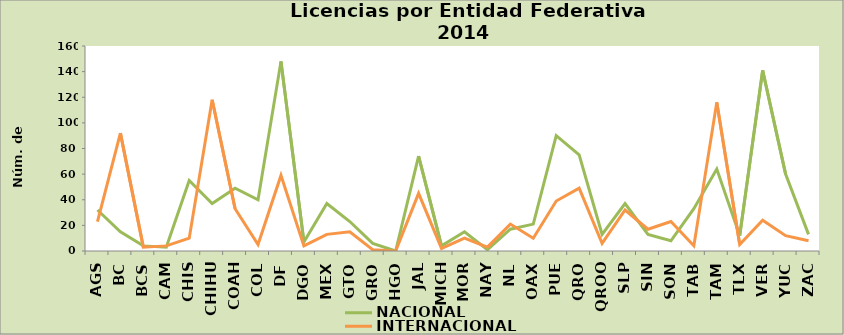
| Category | NACIONAL | INTERNACIONAL |
|---|---|---|
| AGS | 32 | 23 |
| BC | 15 | 92 |
| BCS | 4 | 3 |
| CAM | 3 | 4 |
| CHIS | 55 | 10 |
| CHIHU | 37 | 118 |
| COAH | 49 | 33 |
| COL | 40 | 5 |
| DF | 148 | 59 |
| DGO | 7 | 4 |
| MEX | 37 | 13 |
| GTO | 23 | 15 |
| GRO | 6 | 1 |
| HGO | 0 | 0 |
| JAL | 74 | 45 |
| MICH | 4 | 2 |
| MOR | 15 | 10 |
| NAY | 1 | 3 |
| NL | 17 | 21 |
| OAX | 21 | 10 |
| PUE | 90 | 39 |
| QRO | 75 | 49 |
| QROO | 13 | 6 |
| SLP | 37 | 32 |
| SIN | 13 | 17 |
| SON | 8 | 23 |
| TAB | 33 | 4 |
| TAM | 64 | 116 |
| TLX | 12 | 5 |
| VER | 141 | 24 |
| YUC | 60 | 12 |
| ZAC | 13 | 8 |